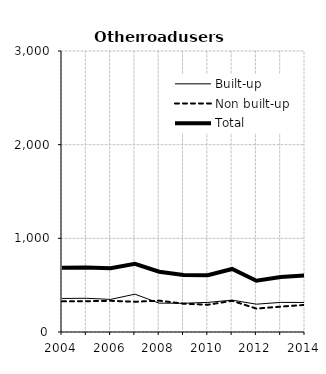
| Category | Built-up | Non built-up | Total |
|---|---|---|---|
| 2004.0 | 358 | 327 | 685 |
| 2005.0 | 360 | 329 | 689 |
| 2006.0 | 348 | 333 | 681 |
| 2007.0 | 404 | 323 | 727 |
| 2008.0 | 308 | 335 | 643 |
| 2009.0 | 307 | 302 | 609 |
| 2010.0 | 316 | 291 | 607 |
| 2011.0 | 340 | 333 | 673 |
| 2012.0 | 297 | 250 | 547 |
| 2013.0 | 316 | 271 | 587 |
| 2014.0 | 315.2 | 289.4 | 604.6 |